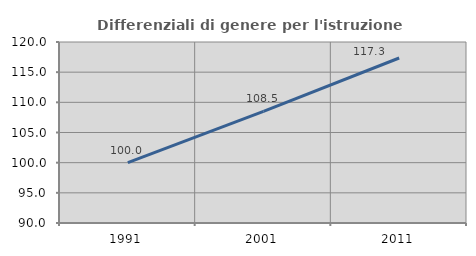
| Category | Differenziali di genere per l'istruzione superiore |
|---|---|
| 1991.0 | 100 |
| 2001.0 | 108.488 |
| 2011.0 | 117.347 |